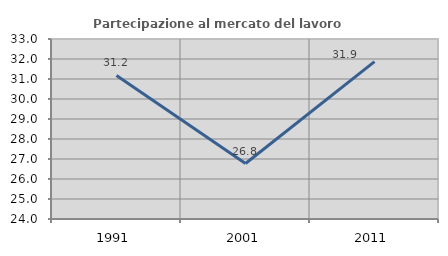
| Category | Partecipazione al mercato del lavoro  femminile |
|---|---|
| 1991.0 | 31.176 |
| 2001.0 | 26.775 |
| 2011.0 | 31.868 |